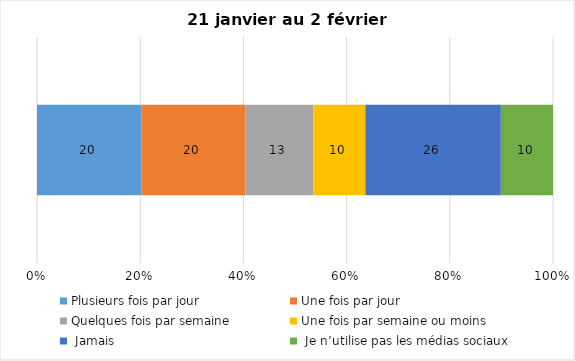
| Category | Plusieurs fois par jour | Une fois par jour | Quelques fois par semaine   | Une fois par semaine ou moins   |  Jamais   |  Je n’utilise pas les médias sociaux |
|---|---|---|---|---|---|---|
| 0 | 20 | 20 | 13 | 10 | 26 | 10 |